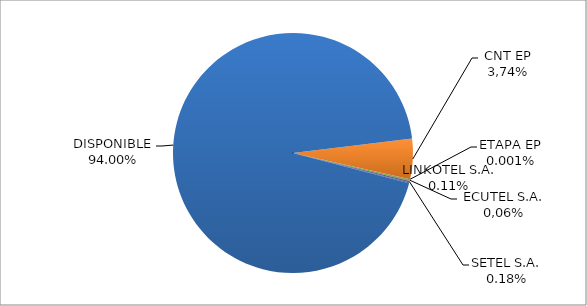
| Category | CODIGO DE AREA 6 |
|---|---|
| CORPORACIÓN NACIONAL TELECOMUNICACIONES CNT EP | 0.055 |
| ETAPA EP | 0 |
| CONECEL (ex ECUADORTELECOM S.A.) | 0.002 |
| SETEL S.A. | 0.002 |
| LINKOTEL S.A. | 0.001 |
| DISPONIBLE | 0.94 |